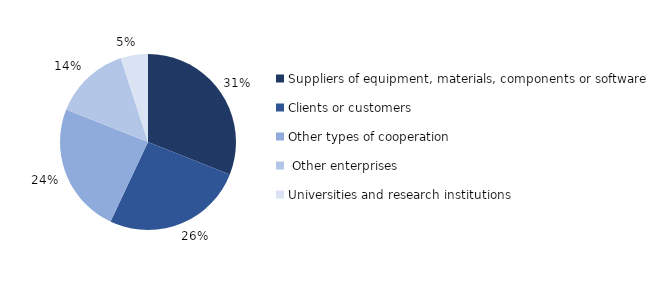
| Category | Series 0 |
|---|---|
| Suppliers of equipment, materials, components or software | 0.31 |
| Clients or customers  | 0.26 |
| Other types of cooperation | 0.24 |
|  Other enterprises  | 0.14 |
| Universities and research institutions | 0.05 |